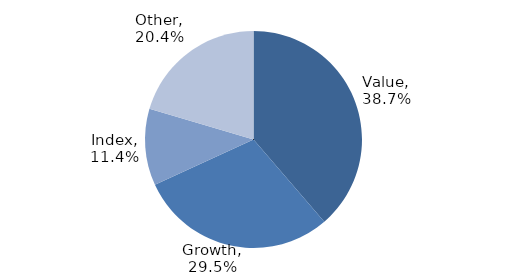
| Category | Investment Style |
|---|---|
| Value | 0.387 |
| Growth | 0.295 |
| Index | 0.114 |
| Other | 0.204 |